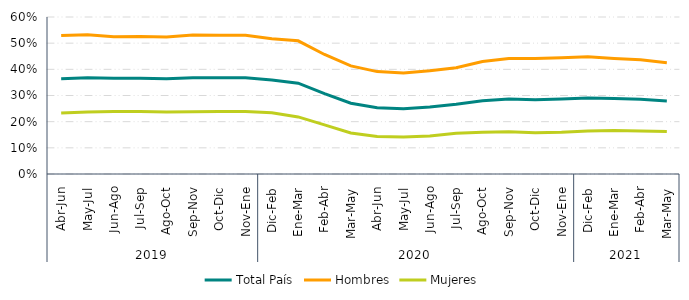
| Category | Total País | Hombres | Mujeres |
|---|---|---|---|
| 0 | 0.364 | 0.529 | 0.233 |
| 1 | 0.368 | 0.532 | 0.237 |
| 2 | 0.366 | 0.525 | 0.239 |
| 3 | 0.366 | 0.526 | 0.239 |
| 4 | 0.364 | 0.523 | 0.237 |
| 5 | 0.368 | 0.531 | 0.237 |
| 6 | 0.368 | 0.53 | 0.239 |
| 7 | 0.368 | 0.53 | 0.239 |
| 8 | 0.359 | 0.517 | 0.234 |
| 9 | 0.347 | 0.509 | 0.218 |
| 10 | 0.307 | 0.457 | 0.188 |
| 11 | 0.271 | 0.413 | 0.157 |
| 12 | 0.253 | 0.391 | 0.143 |
| 13 | 0.25 | 0.386 | 0.141 |
| 14 | 0.256 | 0.395 | 0.145 |
| 15 | 0.267 | 0.406 | 0.156 |
| 16 | 0.28 | 0.43 | 0.16 |
| 17 | 0.286 | 0.442 | 0.162 |
| 18 | 0.284 | 0.442 | 0.158 |
| 19 | 0.286 | 0.444 | 0.16 |
| 20 | 0.29 | 0.448 | 0.164 |
| 21 | 0.289 | 0.442 | 0.166 |
| 22 | 0.286 | 0.436 | 0.164 |
| 23 | 0.279 | 0.426 | 0.162 |